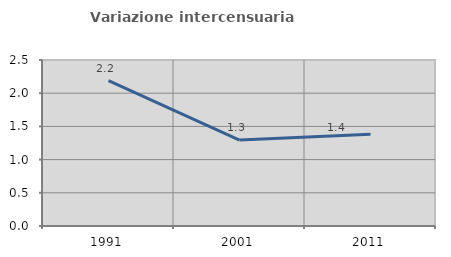
| Category | Variazione intercensuaria annua |
|---|---|
| 1991.0 | 2.188 |
| 2001.0 | 1.294 |
| 2011.0 | 1.381 |